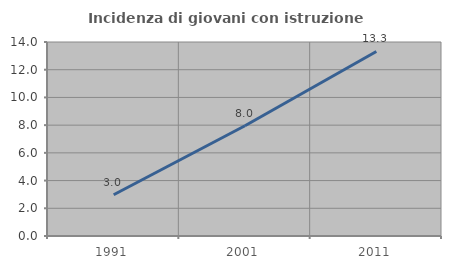
| Category | Incidenza di giovani con istruzione universitaria |
|---|---|
| 1991.0 | 2.976 |
| 2001.0 | 7.957 |
| 2011.0 | 13.318 |